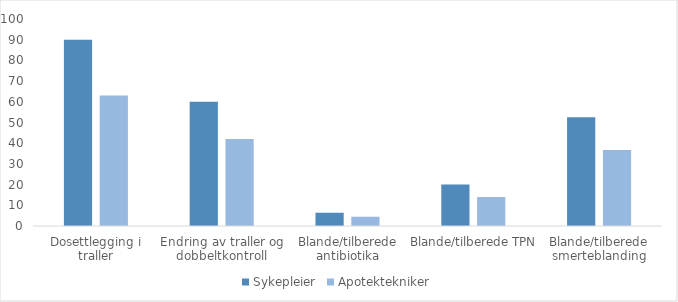
| Category | Sykepleier | Apotektekniker |
|---|---|---|
| Dosettlegging i traller | 90 | 63 |
| Endring av traller og dobbeltkontroll | 60 | 42 |
| Blande/tilberede antibiotika | 6.4 | 4.48 |
| Blande/tilberede TPN | 20 | 14 |
| Blande/tilberede smerteblanding | 52.5 | 36.75 |